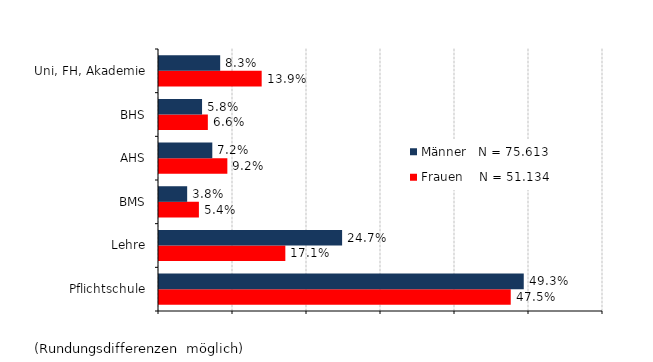
| Category | Frauen    N = 51.134 | Männer   N = 75.613 |
|---|---|---|
| Pflichtschule | 0.475 | 0.493 |
| Lehre | 0.171 | 0.247 |
| BMS | 0.054 | 0.038 |
| AHS | 0.092 | 0.072 |
| BHS | 0.066 | 0.058 |
| Uni, FH, Akademie | 0.139 | 0.083 |